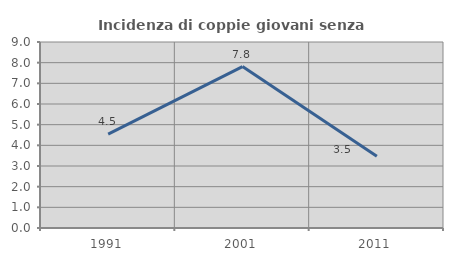
| Category | Incidenza di coppie giovani senza figli |
|---|---|
| 1991.0 | 4.545 |
| 2001.0 | 7.812 |
| 2011.0 | 3.472 |